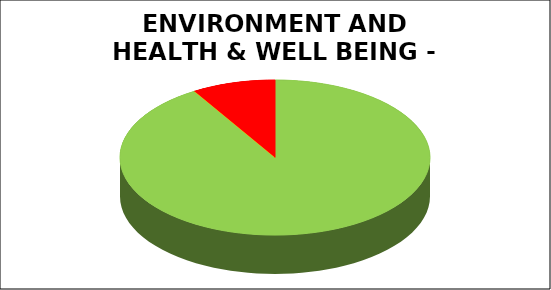
| Category | Series 0 |
|---|---|
| Green | 0.913 |
| Amber | 0 |
| Red | 0.087 |